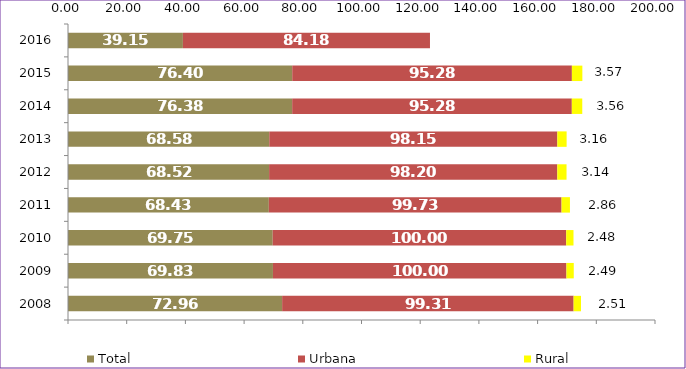
| Category | Total | Urbana | Rural |
|---|---|---|---|
| 2008.0 | 72.96 | 99.31 | 2.51 |
| 2009.0 | 69.83 | 100 | 2.49 |
| 2010.0 | 69.75 | 100 | 2.48 |
| 2011.0 | 68.43 | 99.73 | 2.86 |
| 2012.0 | 68.52 | 98.2 | 3.14 |
| 2013.0 | 68.58 | 98.15 | 3.16 |
| 2014.0 | 76.38 | 95.28 | 3.56 |
| 2015.0 | 76.4 | 95.28 | 3.57 |
| 2016.0 | 39.15 | 84.18 | 0 |